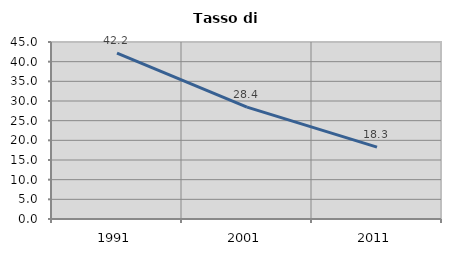
| Category | Tasso di disoccupazione   |
|---|---|
| 1991.0 | 42.185 |
| 2001.0 | 28.435 |
| 2011.0 | 18.289 |